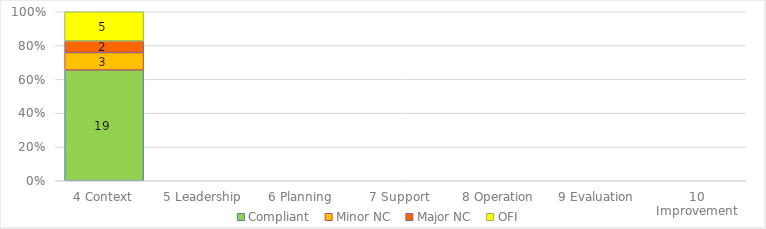
| Category | Compliant | Minor NC | Major NC | OFI |
|---|---|---|---|---|
| 4 Context | 19 | 3 | 2 | 5 |
| 5 Leadership | 0 | 0 | 0 | 0 |
| 6 Planning | 0 | 0 | 0 | 0 |
| 7 Support | 0 | 0 | 0 | 0 |
| 8 Operation | 0 | 0 | 0 | 0 |
| 9 Evaluation | 0 | 0 | 0 | 0 |
| 10 Improvement | 0 | 0 | 0 | 0 |